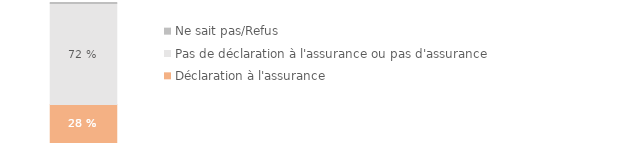
| Category | Déclaration à l'assurance | Pas de déclaration à l'assurance ou pas d'assurance | Ne sait pas/Refus |
|---|---|---|---|
|  | 0.277 | 0.716 | 0.007 |